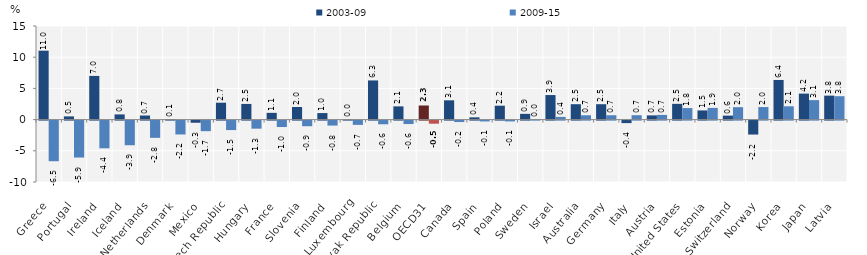
| Category | 2003-09 | 2009-15 |
|---|---|---|
| Greece | 11.044 | -6.508 |
| Portugal | 0.513 | -5.92 |
| Ireland | 6.999 | -4.44 |
| Iceland | 0.833 | -3.949 |
| Netherlands | 0.655 | -2.765 |
| Denmark | 0.077 | -2.222 |
| Mexico | -0.343 | -1.694 |
| Czech Republic | 2.707 | -1.517 |
| Hungary | 2.511 | -1.293 |
| France | 1.08 | -1.033 |
| Slovenia | 2.016 | -0.901 |
| Finland | 1.048 | -0.796 |
| Luxembourg | 0.047 | -0.686 |
| Slovak Republic | 6.276 | -0.59 |
| Belgium | 2.122 | -0.552 |
| OECD31 | 2.261 | -0.495 |
| Canada | 3.091 | -0.232 |
| Spain | 0.363 | -0.136 |
| Poland | 2.227 | -0.132 |
| Sweden | 0.922 | 0.032 |
| Israel | 3.935 | 0.432 |
| Australia | 2.47 | 0.695 |
| Germany | 2.469 | 0.696 |
| Italy | -0.402 | 0.703 |
| Austria | 0.675 | 0.75 |
| United States | 2.523 | 1.846 |
| Estonia | 1.471 | 1.874 |
| Switzerland | 0.638 | 1.99 |
| Norway | -2.234 | 2.011 |
| Korea | 6.353 | 2.132 |
| Japan | 4.165 | 3.121 |
| Latvia | 3.84 | 3.751 |